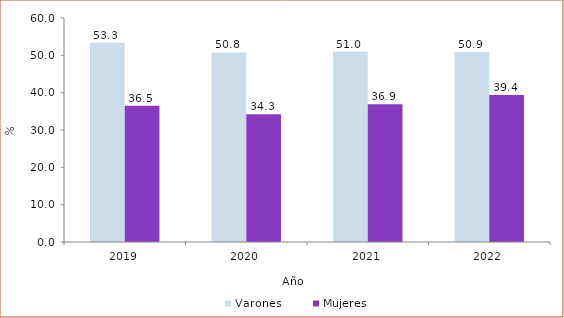
| Category | Varones | Mujeres |
|---|---|---|
| 2019 | 53.344 | 36.483 |
| 2020 | 50.787 | 34.251 |
| 2021 | 50.974 | 36.883 |
| 2022 | 50.9 | 39.4 |